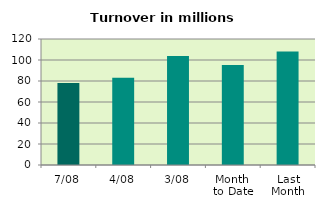
| Category | Series 0 |
|---|---|
| 7/08 | 77.999 |
| 4/08 | 83.133 |
| 3/08 | 103.74 |
| Month 
to Date | 95.134 |
| Last
Month | 108.022 |